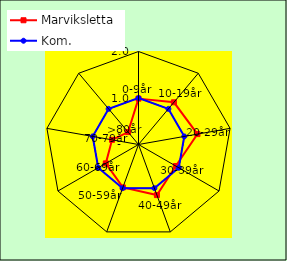
| Category | Marviksletta | Kom. |
|---|---|---|
| 0-9år | 0.987 | 1 |
| 10-19år | 1.185 | 1 |
| 20-29år | 1.288 | 1 |
| 30-39år | 0.926 | 1 |
| 40-49år | 1.158 | 1 |
| 50-59år | 0.982 | 1 |
| 60-69år | 0.812 | 1 |
| 70-79år | 0.578 | 1 |
| >80år | 0.35 | 1 |